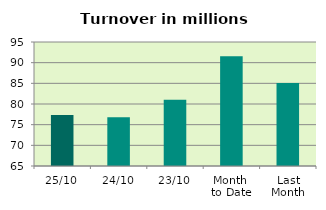
| Category | Series 0 |
|---|---|
| 25/10 | 77.338 |
| 24/10 | 76.812 |
| 23/10 | 81.019 |
| Month 
to Date | 91.563 |
| Last
Month | 85.072 |